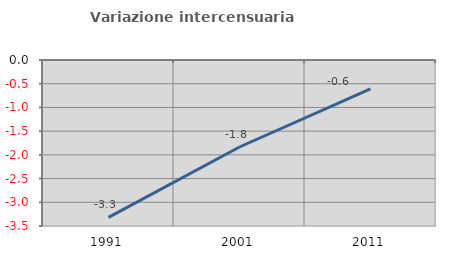
| Category | Variazione intercensuaria annua |
|---|---|
| 1991.0 | -3.318 |
| 2001.0 | -1.834 |
| 2011.0 | -0.61 |